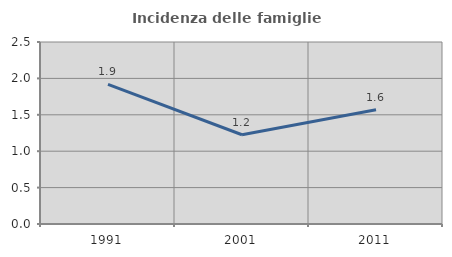
| Category | Incidenza delle famiglie numerose |
|---|---|
| 1991.0 | 1.917 |
| 2001.0 | 1.226 |
| 2011.0 | 1.568 |